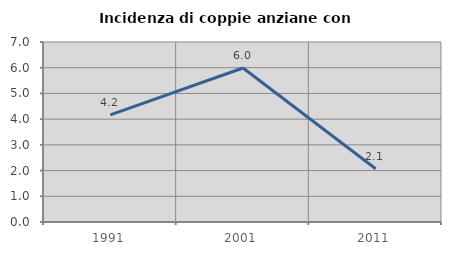
| Category | Incidenza di coppie anziane con figli |
|---|---|
| 1991.0 | 4.167 |
| 2001.0 | 5.988 |
| 2011.0 | 2.069 |